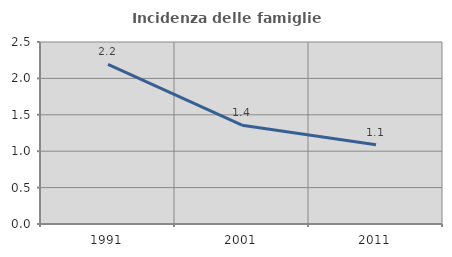
| Category | Incidenza delle famiglie numerose |
|---|---|
| 1991.0 | 2.192 |
| 2001.0 | 1.358 |
| 2011.0 | 1.088 |